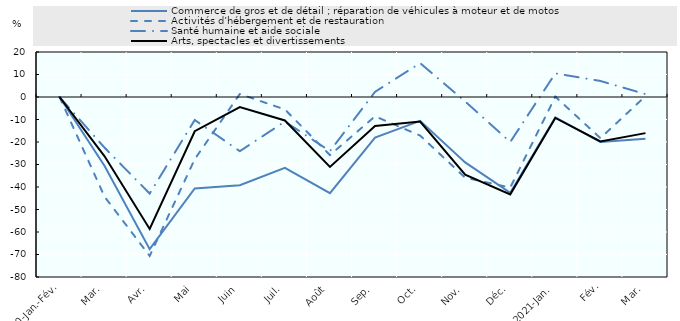
| Category | Commerce de gros et de détail ; réparation de véhicules à moteur et de motos   | Activités d’hébergement et de restauration   | Santé humaine et aide sociale   | Arts, spectacles et divertissements   |
|---|---|---|---|---|
| 2020-Jan.-Fév. | 0 | 0 | 0 | 0 |
| Mar. | -30.635 | -44.342 | -22.543 | -26.372 |
| Avr. | -67.65 | -70.645 | -42.922 | -58.649 |
| Mai | -40.634 | -27.632 | -10.216 | -15.212 |
| Juin | -39.242 | 1.324 | -24.08 | -4.499 |
| Juil. | -31.518 | -5.53 | -10.903 | -10.445 |
| Août | -42.714 | -25.819 | -24.037 | -31.095 |
| Sep. | -18.031 | -8.581 | 2.294 | -12.924 |
| Oct. | -10.593 | -17.136 | 15.062 | -10.93 |
| Nov. | -29.056 | -35.869 | -1.981 | -34.561 |
| Déc. | -42.574 | -40.238 | -19.986 | -43.276 |
| 2021-Jan. | -9.015 | 0.144 | 10.502 | -9.314 |
| Fév. | -19.949 | -18.275 | 7.123 | -19.743 |
| Mar. | -18.522 | 0.367 | 1.29 | -16.061 |